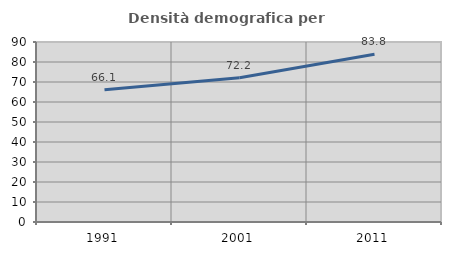
| Category | Densità demografica |
|---|---|
| 1991.0 | 66.139 |
| 2001.0 | 72.17 |
| 2011.0 | 83.824 |